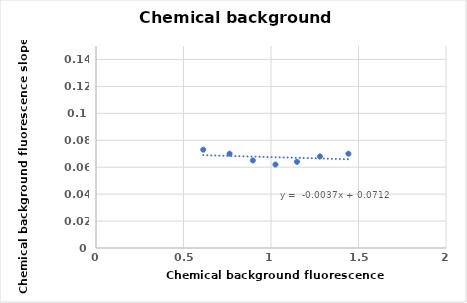
| Category | Series 0 |
|---|---|
| 0.6128 | 0.073 |
| 0.7634 | 0.07 |
| 0.8964 | 0.065 |
| 1.0256 | 0.062 |
| 1.1484 | 0.064 |
| 1.2795 | 0.068 |
| 1.4426 | 0.07 |